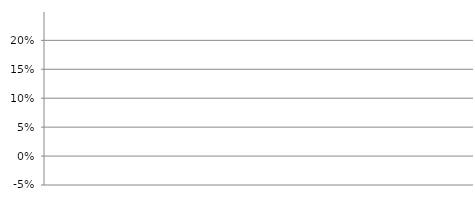
| Category | Zinsbelastungsanteil (Nettozinsaufwand / Laufender Ertrag) |
|---|---|
| 2018.0 | 0 |
| 2019.0 | 0 |
| 2020.0 | 0 |
| 2021.0 | 0 |
| 2022.0 | 0 |